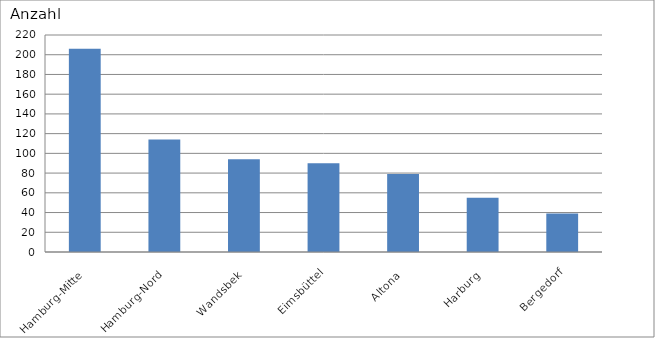
| Category | Hamburg-Mitte |
|---|---|
| Hamburg-Mitte | 206 |
| Hamburg-Nord | 114 |
| Wandsbek | 94 |
| Eimsbüttel | 90 |
| Altona | 79 |
| Harburg | 55 |
| Bergedorf | 39 |